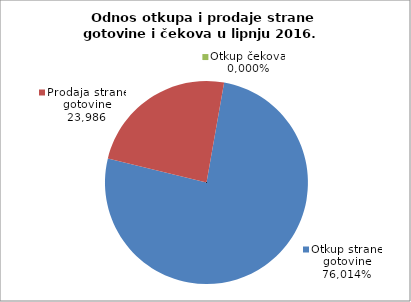
| Category | Otkup strane gotovine |
|---|---|
| 0 | 0.76 |
| 1 | 0.24 |
| 2 | 0 |